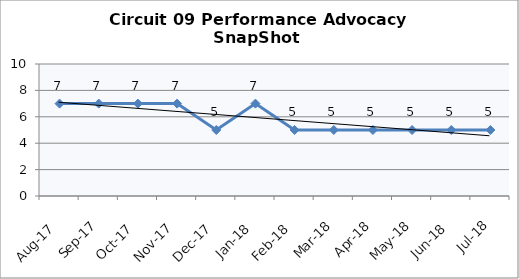
| Category | Circuit 09 |
|---|---|
| Aug-17 | 7 |
| Sep-17 | 7 |
| Oct-17 | 7 |
| Nov-17 | 7 |
| Dec-17 | 5 |
| Jan-18 | 7 |
| Feb-18 | 5 |
| Mar-18 | 5 |
| Apr-18 | 5 |
| May-18 | 5 |
| Jun-18 | 5 |
| Jul-18 | 5 |